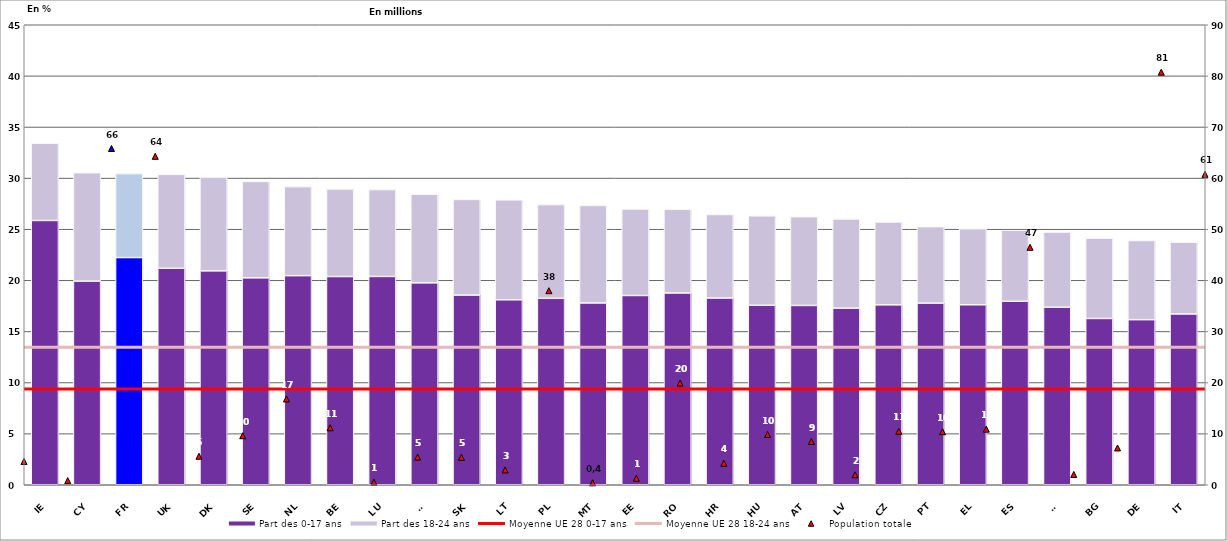
| Category | Part des 0-17 ans | Part des 18-24 ans |
|---|---|---|
| IE | 25.856 | 7.56 |
| CY | 19.917 | 10.608 |
| FR | 22.225 | 8.214 |
| UK | 21.176 | 9.185 |
| DK | 20.924 | 9.174 |
| SE | 20.244 | 9.427 |
| NL | 20.457 | 8.708 |
| BE | 20.372 | 8.559 |
| LU | 20.379 | 8.496 |
| FI | 19.751 | 8.672 |
| SK | 18.557 | 9.354 |
| LT | 18.096 | 9.774 |
| PL | 18.239 | 9.171 |
| MT | 17.786 | 9.536 |
| EE | 18.516 | 8.462 |
| RO | 18.762 | 8.185 |
| HR | 18.269 | 8.171 |
| HU | 17.56 | 8.749 |
| AT | 17.543 | 8.684 |
| LV | 17.279 | 8.724 |
| CZ | 17.601 | 8.105 |
| PT | 17.77 | 7.478 |
| EL | 17.607 | 7.441 |
| ES | 17.951 | 6.951 |
| SI | 17.369 | 7.353 |
| BG | 16.268 | 7.858 |
| DE | 16.149 | 7.745 |
| IT | 16.712 | 7.021 |